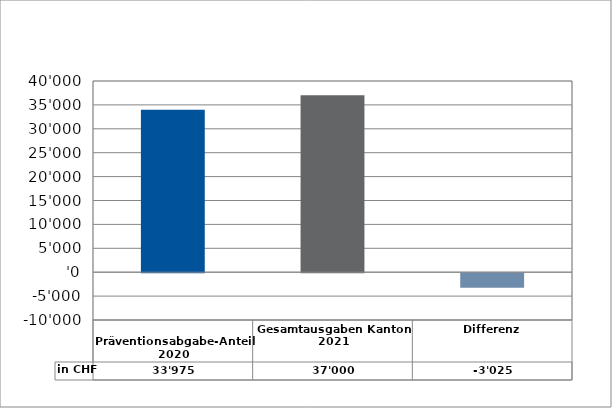
| Category | in CHF |
|---|---|
| 
Präventionsabgabe-Anteil 2020

 | 33975 |
| Gesamtausgaben Kanton 2021
 | 37000 |
| Differenz | -3025 |